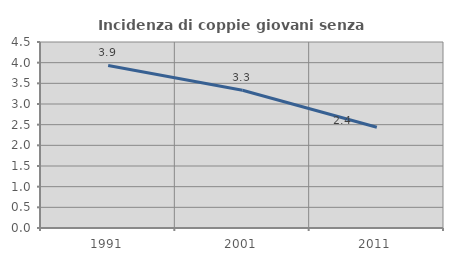
| Category | Incidenza di coppie giovani senza figli |
|---|---|
| 1991.0 | 3.932 |
| 2001.0 | 3.332 |
| 2011.0 | 2.439 |